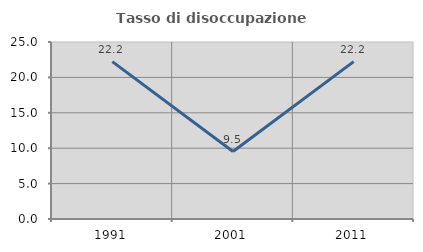
| Category | Tasso di disoccupazione giovanile  |
|---|---|
| 1991.0 | 22.222 |
| 2001.0 | 9.524 |
| 2011.0 | 22.222 |